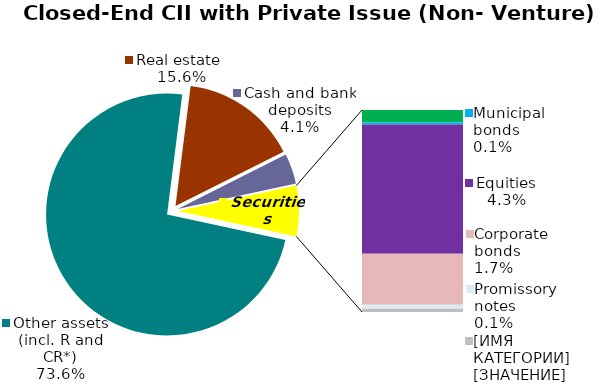
| Category | Series 0 |
|---|---|
| Other assets (incl. R and CR*) | 0.736 |
| Real estate  | 0.156 |
| Cash and bank deposits | 0.041 |
| Bank metals | 0 |
| State bonds (incl.OVDP) | 0.004 |
| Municipal bonds | 0.001 |
| Equities | 0.043 |
| Corporate bonds | 0.017 |
| Promissory notes | 0.001 |
| Other securities & derivatives | 0.001 |